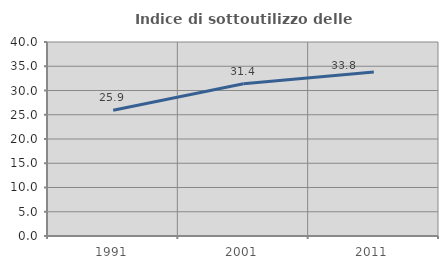
| Category | Indice di sottoutilizzo delle abitazioni  |
|---|---|
| 1991.0 | 25.916 |
| 2001.0 | 31.403 |
| 2011.0 | 33.8 |